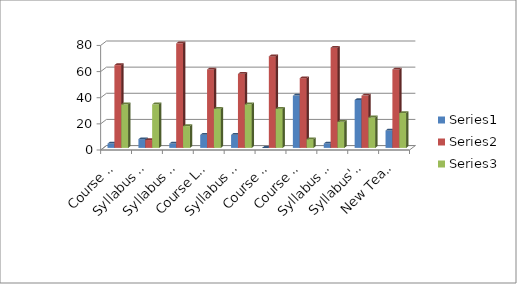
| Category | Series 0 | Series 1 | Series 2 |
|---|---|---|---|
| Course Objectives Clarity | 3.33 | 63.33 | 33.33 |
| Syllabus Organization | 6.66 | 6 | 33.33 |
| Syllabus Contents | 3.33 | 80 | 16.66 |
| Course Learing Outcomes | 10 | 60 | 30 |
| Syllabus Refernces  | 10 | 56.66 | 33.33 |
| Course Utility | 0 | 70 | 30 |
| Course Optional Papers | 40 | 53.33 | 6.66 |
| Syllabus Teching Compatibility  | 3.33 | 76.66 | 20 |
| Syllabus' Improvement Scope | 36.66 | 40 | 23.33 |
| New Teaching Techniques | 13.33 | 60 | 26.66 |